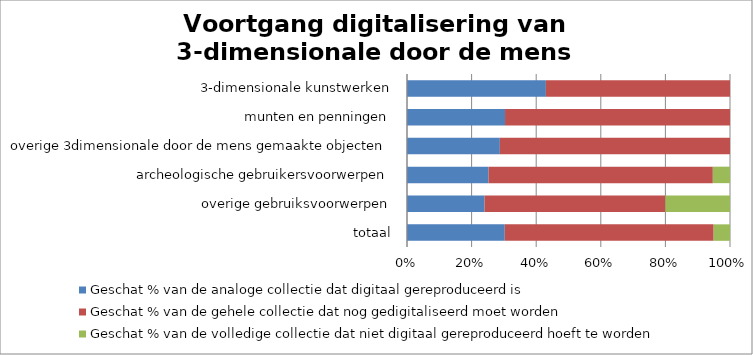
| Category | Geschat % van de analoge collectie dat digitaal gereproduceerd is  | Geschat % van de gehele collectie dat nog gedigitaliseerd moet worden | Geschat % van de volledige collectie dat niet digitaal gereproduceerd hoeft te worden |
|---|---|---|---|
| totaal | 30.317 | 64.783 | 5.067 |
| overige gebruiksvoorwerpen | 24 | 56 | 20 |
| archeologische gebruikersvoorwerpen | 25.333 | 69.667 | 5.333 |
| overige 3dimensionale door de mens gemaakte objecten | 28.75 | 71.25 | 0 |
| munten en penningen | 30.5 | 70 | 0 |
| 3-dimensionale kunstwerken | 43 | 57 | 0 |